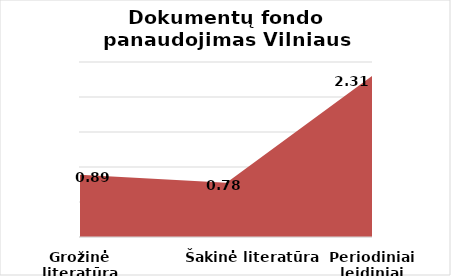
| Category | Series 0 |
|---|---|
| Grožinė literatūra | 0.89 |
| Šakinė literatūra | 0.776 |
| Periodiniai leidiniai | 2.31 |